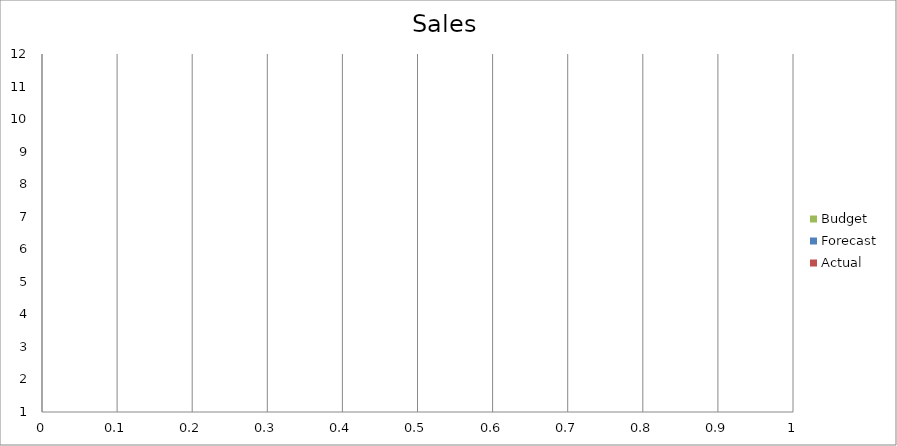
| Category | Budget | Forecast | Actual |
|---|---|---|---|
| 0 | 1260 | 1780 | 3040 |
| 1 | 1210 | 2880 | 1320 |
| 2 | 2660 | 1510 | 1880 |
| 3 | 1950 | 2450 | 2670 |
| 4 | 1140 | 1140 | 1550 |
| 5 | 3140 | 810 | 3320 |
| 6 | 2120 | 3490 | 3320 |
| 7 | 1020 | 2640 | 1080 |
| 8 | 2870 | 2880 | 2720 |
| 9 | 2840 | 3130 | 2990 |
| 10 | 2190 | 1300 | 500 |
| 11 | 2310 | 2190 | 3320 |